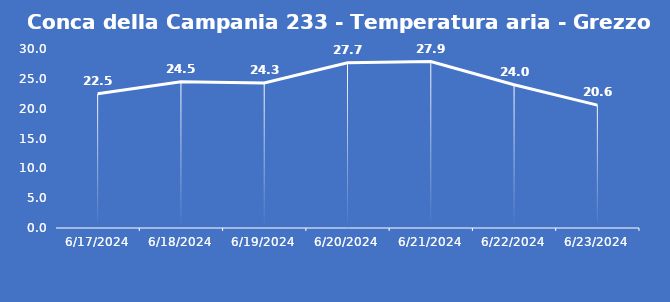
| Category | Conca della Campania 233 - Temperatura aria - Grezzo (°C) |
|---|---|
| 6/17/24 | 22.5 |
| 6/18/24 | 24.5 |
| 6/19/24 | 24.3 |
| 6/20/24 | 27.7 |
| 6/21/24 | 27.9 |
| 6/22/24 | 24 |
| 6/23/24 | 20.6 |